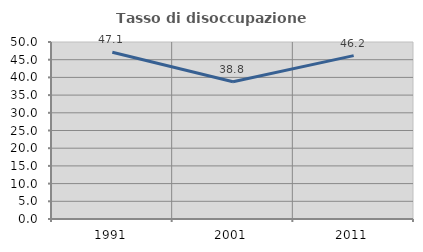
| Category | Tasso di disoccupazione giovanile  |
|---|---|
| 1991.0 | 47.085 |
| 2001.0 | 38.776 |
| 2011.0 | 46.154 |